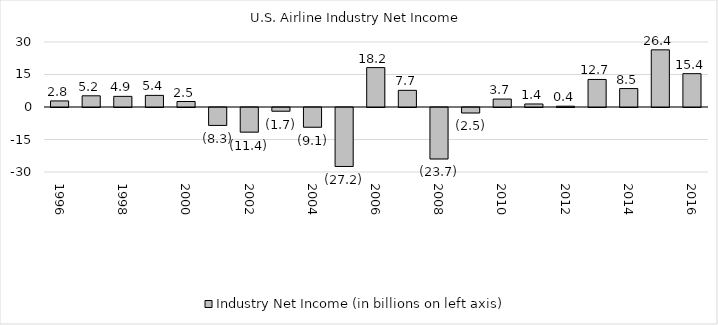
| Category | Industry Net Income (in billions on left axis) |
|---|---|
| 1996.0 | 2.804 |
| 1997.0 | 5.168 |
| 1998.0 | 4.911 |
| 1999.0 | 5.361 |
| 2000.0 | 2.533 |
| 2001.0 | -8.267 |
| 2002.0 | -11.365 |
| 2003.0 | -1.715 |
| 2004.0 | -9.104 |
| 2005.0 | -27.22 |
| 2006.0 | 18.186 |
| 2007.0 | 7.691 |
| 2008.0 | -23.75 |
| 2009.0 | -2.526 |
| 2010.0 | 3.666 |
| 2011.0 | 1.392 |
| 2012.0 | 0.364 |
| 2013.0 | 12.711 |
| 2014.0 | 8.505 |
| 2015.0 | 26.383 |
| 2016.0 | 15.383 |